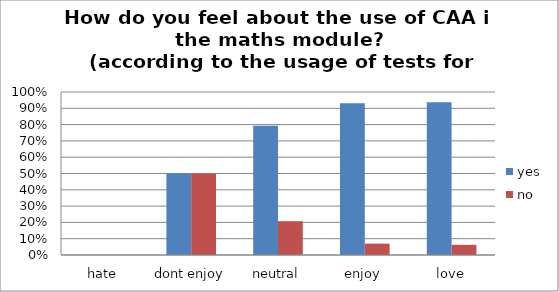
| Category | yes | no |
|---|---|---|
| hate | 0 | 0 |
| dont enjoy | 0.5 | 0.5 |
| neutral | 0.793 | 0.207 |
| enjoy | 0.93 | 0.07 |
| love | 0.938 | 0.062 |